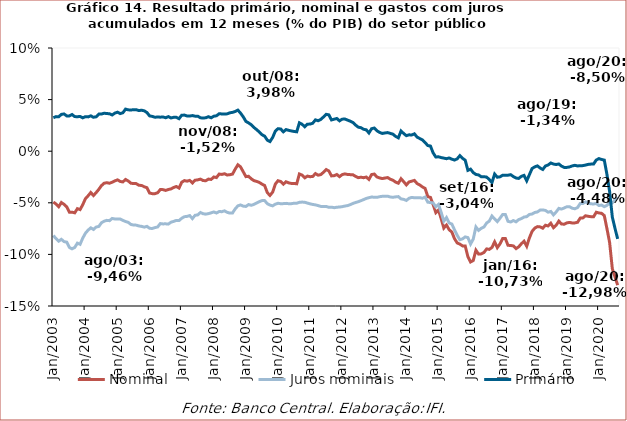
| Category | Nominal | Juros nominais | Primário |
|---|---|---|---|
| 2003-01-01 | -0.049 | -0.082 | 0.032 |
| 2003-02-01 | -0.051 | -0.085 | 0.034 |
| 2003-03-01 | -0.054 | -0.087 | 0.033 |
| 2003-04-01 | -0.05 | -0.085 | 0.036 |
| 2003-05-01 | -0.051 | -0.088 | 0.036 |
| 2003-06-01 | -0.054 | -0.088 | 0.034 |
| 2003-07-01 | -0.059 | -0.093 | 0.034 |
| 2003-08-01 | -0.059 | -0.095 | 0.036 |
| 2003-09-01 | -0.06 | -0.093 | 0.034 |
| 2003-10-01 | -0.056 | -0.089 | 0.033 |
| 2003-11-01 | -0.057 | -0.09 | 0.034 |
| 2003-12-01 | -0.052 | -0.084 | 0.032 |
| 2004-01-01 | -0.046 | -0.079 | 0.033 |
| 2004-02-01 | -0.043 | -0.076 | 0.033 |
| 2004-03-01 | -0.04 | -0.074 | 0.034 |
| 2004-04-01 | -0.043 | -0.076 | 0.033 |
| 2004-05-01 | -0.04 | -0.073 | 0.033 |
| 2004-06-01 | -0.037 | -0.073 | 0.036 |
| 2004-07-01 | -0.033 | -0.069 | 0.036 |
| 2004-08-01 | -0.031 | -0.068 | 0.037 |
| 2004-09-01 | -0.031 | -0.067 | 0.036 |
| 2004-10-01 | -0.031 | -0.067 | 0.036 |
| 2004-11-01 | -0.03 | -0.065 | 0.035 |
| 2004-12-01 | -0.029 | -0.066 | 0.037 |
| 2005-01-01 | -0.028 | -0.066 | 0.038 |
| 2005-02-01 | -0.029 | -0.066 | 0.036 |
| 2005-03-01 | -0.03 | -0.067 | 0.037 |
| 2005-04-01 | -0.027 | -0.068 | 0.041 |
| 2005-05-01 | -0.029 | -0.069 | 0.04 |
| 2005-06-01 | -0.031 | -0.071 | 0.04 |
| 2005-07-01 | -0.031 | -0.072 | 0.04 |
| 2005-08-01 | -0.031 | -0.072 | 0.04 |
| 2005-09-01 | -0.033 | -0.072 | 0.039 |
| 2005-10-01 | -0.033 | -0.073 | 0.04 |
| 2005-11-01 | -0.034 | -0.074 | 0.039 |
| 2005-12-01 | -0.035 | -0.073 | 0.037 |
| 2006-01-01 | -0.041 | -0.075 | 0.034 |
| 2006-02-01 | -0.041 | -0.075 | 0.034 |
| 2006-03-01 | -0.041 | -0.074 | 0.033 |
| 2006-04-01 | -0.04 | -0.073 | 0.033 |
| 2006-05-01 | -0.037 | -0.07 | 0.033 |
| 2006-06-01 | -0.037 | -0.07 | 0.033 |
| 2006-07-01 | -0.038 | -0.07 | 0.032 |
| 2006-08-01 | -0.037 | -0.071 | 0.034 |
| 2006-09-01 | -0.037 | -0.069 | 0.032 |
| 2006-10-01 | -0.035 | -0.068 | 0.033 |
| 2006-11-01 | -0.034 | -0.067 | 0.033 |
| 2006-12-01 | -0.036 | -0.067 | 0.032 |
| 2007-01-01 | -0.03 | -0.065 | 0.035 |
| 2007-02-01 | -0.028 | -0.063 | 0.035 |
| 2007-03-01 | -0.029 | -0.063 | 0.034 |
| 2007-04-01 | -0.028 | -0.062 | 0.034 |
| 2007-05-01 | -0.031 | -0.065 | 0.035 |
| 2007-06-01 | -0.028 | -0.062 | 0.034 |
| 2007-07-01 | -0.028 | -0.062 | 0.034 |
| 2007-08-01 | -0.027 | -0.059 | 0.032 |
| 2007-09-01 | -0.028 | -0.061 | 0.032 |
| 2007-10-01 | -0.029 | -0.061 | 0.032 |
| 2007-11-01 | -0.027 | -0.06 | 0.033 |
| 2007-12-01 | -0.027 | -0.06 | 0.032 |
| 2008-01-01 | -0.025 | -0.059 | 0.034 |
| 2008-02-01 | -0.026 | -0.06 | 0.034 |
| 2008-03-01 | -0.022 | -0.058 | 0.036 |
| 2008-04-01 | -0.022 | -0.059 | 0.036 |
| 2008-05-01 | -0.022 | -0.058 | 0.036 |
| 2008-06-01 | -0.023 | -0.059 | 0.036 |
| 2008-07-01 | -0.023 | -0.06 | 0.037 |
| 2008-08-01 | -0.022 | -0.06 | 0.038 |
| 2008-09-01 | -0.017 | -0.056 | 0.039 |
| 2008-10-01 | -0.013 | -0.053 | 0.04 |
| 2008-11-01 | -0.015 | -0.052 | 0.037 |
| 2008-12-01 | -0.02 | -0.053 | 0.033 |
| 2009-01-01 | -0.025 | -0.054 | 0.029 |
| 2009-02-01 | -0.024 | -0.052 | 0.027 |
| 2009-03-01 | -0.027 | -0.052 | 0.026 |
| 2009-04-01 | -0.029 | -0.052 | 0.023 |
| 2009-05-01 | -0.029 | -0.05 | 0.021 |
| 2009-06-01 | -0.03 | -0.049 | 0.019 |
| 2009-07-01 | -0.032 | -0.048 | 0.016 |
| 2009-08-01 | -0.033 | -0.048 | 0.015 |
| 2009-09-01 | -0.04 | -0.051 | 0.011 |
| 2009-10-01 | -0.043 | -0.052 | 0.009 |
| 2009-11-01 | -0.04 | -0.053 | 0.013 |
| 2009-12-01 | -0.032 | -0.051 | 0.019 |
| 2010-01-01 | -0.029 | -0.05 | 0.022 |
| 2010-02-01 | -0.029 | -0.051 | 0.022 |
| 2010-03-01 | -0.032 | -0.051 | 0.019 |
| 2010-04-01 | -0.03 | -0.051 | 0.021 |
| 2010-05-01 | -0.031 | -0.051 | 0.02 |
| 2010-06-01 | -0.031 | -0.051 | 0.02 |
| 2010-07-01 | -0.031 | -0.05 | 0.019 |
| 2010-08-01 | -0.032 | -0.05 | 0.019 |
| 2010-09-01 | -0.022 | -0.05 | 0.028 |
| 2010-10-01 | -0.023 | -0.049 | 0.026 |
| 2010-11-01 | -0.026 | -0.049 | 0.024 |
| 2010-12-01 | -0.024 | -0.05 | 0.026 |
| 2011-01-01 | -0.025 | -0.051 | 0.026 |
| 2011-02-01 | -0.024 | -0.052 | 0.027 |
| 2011-03-01 | -0.022 | -0.052 | 0.03 |
| 2011-04-01 | -0.023 | -0.053 | 0.029 |
| 2011-05-01 | -0.023 | -0.053 | 0.031 |
| 2011-06-01 | -0.02 | -0.054 | 0.033 |
| 2011-07-01 | -0.018 | -0.054 | 0.036 |
| 2011-08-01 | -0.019 | -0.054 | 0.035 |
| 2011-09-01 | -0.024 | -0.054 | 0.03 |
| 2011-10-01 | -0.024 | -0.055 | 0.031 |
| 2011-11-01 | -0.023 | -0.054 | 0.032 |
| 2011-12-01 | -0.025 | -0.054 | 0.029 |
| 2012-01-01 | -0.023 | -0.054 | 0.031 |
| 2012-02-01 | -0.022 | -0.053 | 0.031 |
| 2012-03-01 | -0.023 | -0.053 | 0.03 |
| 2012-04-01 | -0.023 | -0.052 | 0.029 |
| 2012-05-01 | -0.023 | -0.051 | 0.028 |
| 2012-06-01 | -0.024 | -0.05 | 0.025 |
| 2012-07-01 | -0.026 | -0.049 | 0.023 |
| 2012-08-01 | -0.025 | -0.048 | 0.023 |
| 2012-09-01 | -0.026 | -0.047 | 0.021 |
| 2012-10-01 | -0.025 | -0.046 | 0.021 |
| 2012-11-01 | -0.027 | -0.045 | 0.018 |
| 2012-12-01 | -0.023 | -0.044 | 0.022 |
| 2013-01-01 | -0.022 | -0.045 | 0.022 |
| 2013-02-01 | -0.025 | -0.045 | 0.02 |
| 2013-03-01 | -0.026 | -0.044 | 0.018 |
| 2013-04-01 | -0.027 | -0.044 | 0.017 |
| 2013-05-01 | -0.026 | -0.044 | 0.018 |
| 2013-06-01 | -0.026 | -0.044 | 0.018 |
| 2013-07-01 | -0.027 | -0.044 | 0.017 |
| 2013-08-01 | -0.028 | -0.045 | 0.016 |
| 2013-09-01 | -0.03 | -0.044 | 0.014 |
| 2013-10-01 | -0.031 | -0.044 | 0.013 |
| 2013-11-01 | -0.027 | -0.046 | 0.02 |
| 2013-12-01 | -0.03 | -0.047 | 0.017 |
| 2014-01-01 | -0.033 | -0.048 | 0.015 |
| 2014-02-01 | -0.03 | -0.046 | 0.016 |
| 2014-03-01 | -0.029 | -0.045 | 0.016 |
| 2014-04-01 | -0.028 | -0.045 | 0.017 |
| 2014-05-01 | -0.031 | -0.045 | 0.014 |
| 2014-06-01 | -0.033 | -0.045 | 0.012 |
| 2014-07-01 | -0.035 | -0.046 | 0.011 |
| 2014-08-01 | -0.036 | -0.044 | 0.008 |
| 2014-09-01 | -0.044 | -0.049 | 0.005 |
| 2014-10-01 | -0.045 | -0.05 | 0.005 |
| 2014-11-01 | -0.052 | -0.05 | -0.002 |
| 2014-12-01 | -0.06 | -0.054 | -0.006 |
| 2015-01-01 | -0.057 | -0.052 | -0.005 |
| 2015-02-01 | -0.065 | -0.059 | -0.006 |
| 2015-03-01 | -0.074 | -0.068 | -0.007 |
| 2015-04-01 | -0.072 | -0.064 | -0.007 |
| 2015-05-01 | -0.076 | -0.07 | -0.007 |
| 2015-06-01 | -0.078 | -0.071 | -0.008 |
| 2015-07-01 | -0.085 | -0.076 | -0.009 |
| 2015-08-01 | -0.089 | -0.082 | -0.007 |
| 2015-09-01 | -0.09 | -0.086 | -0.004 |
| 2015-10-01 | -0.092 | -0.085 | -0.007 |
| 2015-11-01 | -0.092 | -0.083 | -0.009 |
| 2015-12-01 | -0.102 | -0.084 | -0.019 |
| 2016-01-01 | -0.107 | -0.09 | -0.017 |
| 2016-02-01 | -0.106 | -0.085 | -0.021 |
| 2016-03-01 | -0.096 | -0.073 | -0.023 |
| 2016-04-01 | -0.1 | -0.077 | -0.023 |
| 2016-05-01 | -0.099 | -0.075 | -0.025 |
| 2016-06-01 | -0.098 | -0.073 | -0.025 |
| 2016-07-01 | -0.095 | -0.07 | -0.025 |
| 2016-08-01 | -0.095 | -0.068 | -0.027 |
| 2016-09-01 | -0.093 | -0.063 | -0.03 |
| 2016-10-01 | -0.088 | -0.066 | -0.022 |
| 2016-11-01 | -0.093 | -0.068 | -0.025 |
| 2016-12-01 | -0.09 | -0.065 | -0.025 |
| 2017-01-01 | -0.085 | -0.061 | -0.023 |
| 2017-02-01 | -0.085 | -0.061 | -0.023 |
| 2017-03-01 | -0.091 | -0.068 | -0.023 |
| 2017-04-01 | -0.091 | -0.069 | -0.023 |
| 2017-05-01 | -0.092 | -0.067 | -0.025 |
| 2017-06-01 | -0.094 | -0.068 | -0.026 |
| 2017-07-01 | -0.093 | -0.066 | -0.026 |
| 2017-08-01 | -0.09 | -0.065 | -0.024 |
| 2017-09-01 | -0.087 | -0.064 | -0.023 |
| 2017-10-01 | -0.092 | -0.063 | -0.029 |
| 2017-11-01 | -0.084 | -0.061 | -0.023 |
| 2017-12-01 | -0.078 | -0.061 | -0.017 |
| 2018-01-01 | -0.075 | -0.059 | -0.015 |
| 2018-02-01 | -0.073 | -0.059 | -0.014 |
| 2018-03-01 | -0.073 | -0.057 | -0.016 |
| 2018-04-01 | -0.075 | -0.057 | -0.018 |
| 2018-05-01 | -0.072 | -0.057 | -0.014 |
| 2018-06-01 | -0.072 | -0.059 | -0.013 |
| 2018-07-01 | -0.07 | -0.058 | -0.011 |
| 2018-08-01 | -0.074 | -0.062 | -0.012 |
| 2018-09-01 | -0.072 | -0.059 | -0.013 |
| 2018-10-01 | -0.068 | -0.055 | -0.012 |
| 2018-11-01 | -0.071 | -0.056 | -0.014 |
| 2018-12-01 | -0.071 | -0.055 | -0.016 |
| 2019-01-01 | -0.069 | -0.054 | -0.016 |
| 2019-02-01 | -0.069 | -0.054 | -0.015 |
| 2019-03-01 | -0.07 | -0.055 | -0.014 |
| 2019-04-01 | -0.069 | -0.056 | -0.014 |
| 2019-05-01 | -0.069 | -0.055 | -0.014 |
| 2019-06-01 | -0.065 | -0.051 | -0.014 |
| 2019-07-01 | -0.065 | -0.051 | -0.014 |
| 2019-08-01 | -0.063 | -0.049 | -0.013 |
| 2019-09-01 | -0.063 | -0.05 | -0.013 |
| 2019-10-01 | -0.063 | -0.051 | -0.012 |
| 2019-11-01 | -0.064 | -0.051 | -0.012 |
| 2019-12-01 | -0.059 | -0.051 | -0.009 |
| 2020-01-01 | -0.06 | -0.053 | -0.007 |
| 2020-02-01 | -0.06 | -0.052 | -0.008 |
| 2020-03-01 | -0.062 | -0.054 | -0.009 |
| 2020-04-01 | -0.075 | -0.052 | -0.023 |
| 2020-05-01 | -0.089 | -0.049 | -0.039 |
| 2020-06-01 | -0.114 | -0.05 | -0.064 |
| 2020-07-01 | -0.122 | -0.047 | -0.075 |
| 2020-08-01 | -0.13 | -0.045 | -0.085 |